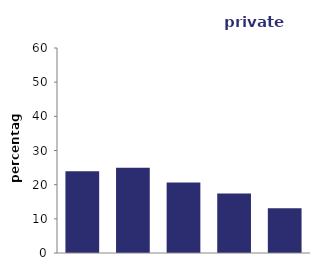
| Category | private rented |
|---|---|
| most deprived 20% | 23.961 |
| 2nd | 24.938 |
| 3rd | 20.601 |
| 4th | 17.39 |
| least deprived 20% | 13.109 |